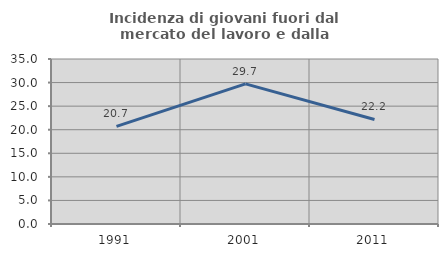
| Category | Incidenza di giovani fuori dal mercato del lavoro e dalla formazione  |
|---|---|
| 1991.0 | 20.718 |
| 2001.0 | 29.726 |
| 2011.0 | 22.172 |